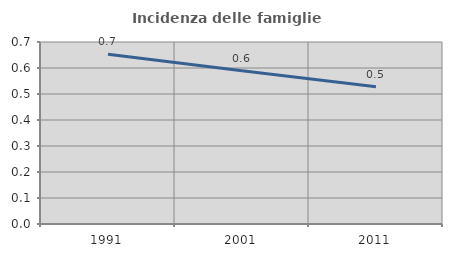
| Category | Incidenza delle famiglie numerose |
|---|---|
| 1991.0 | 0.653 |
| 2001.0 | 0.589 |
| 2011.0 | 0.528 |